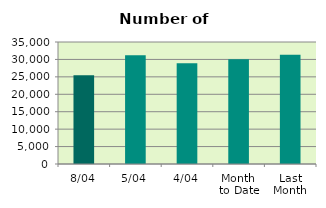
| Category | Series 0 |
|---|---|
| 8/04 | 25426 |
| 5/04 | 31232 |
| 4/04 | 28888 |
| Month 
to Date | 30054.333 |
| Last
Month | 31344.095 |